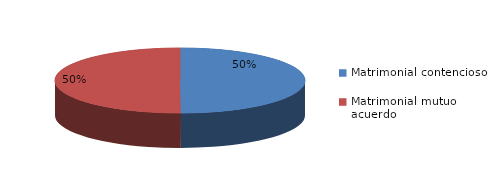
| Category | Series 0 |
|---|---|
| 0 | 238 |
| 1 | 239 |